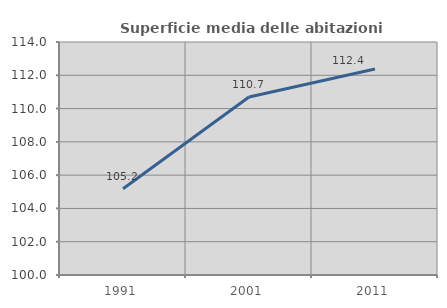
| Category | Superficie media delle abitazioni occupate |
|---|---|
| 1991.0 | 105.186 |
| 2001.0 | 110.694 |
| 2011.0 | 112.378 |